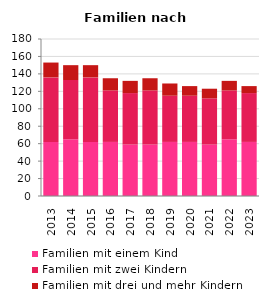
| Category | Familien mit einem Kind | Familien mit zwei Kindern | Familien mit drei und mehr Kindern |
|---|---|---|---|
| 2013.0 | 62 | 74 | 17 |
| 2014.0 | 65 | 68 | 17 |
| 2015.0 | 62 | 74 | 14 |
| 2016.0 | 62 | 59 | 14 |
| 2017.0 | 59 | 59 | 14 |
| 2018.0 | 59 | 62 | 14 |
| 2019.0 | 62 | 53 | 14 |
| 2020.0 | 62 | 53 | 11 |
| 2021.0 | 59 | 53 | 11 |
| 2022.0 | 65 | 56 | 11 |
| 2023.0 | 62 | 56 | 8 |